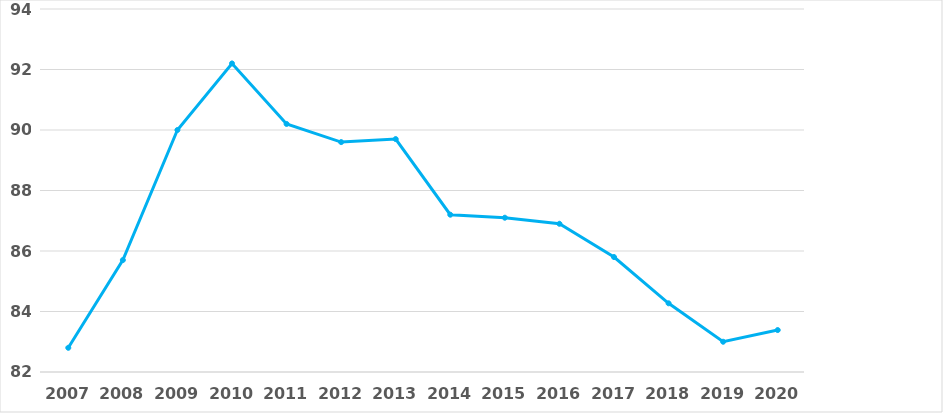
| Category | Series 0 |
|---|---|
| 2007.0 | 82.8 |
| 2008.0 | 85.7 |
| 2009.0 | 90 |
| 2010.0 | 92.2 |
| 2011.0 | 90.2 |
| 2012.0 | 89.6 |
| 2013.0 | 89.7 |
| 2014.0 | 87.2 |
| 2015.0 | 87.1 |
| 2016.0 | 86.9 |
| 2017.0 | 85.8 |
| 2018.0 | 84.271 |
| 2019.0 | 83 |
| 2020.0 | 83.387 |